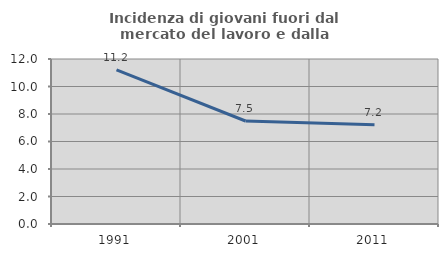
| Category | Incidenza di giovani fuori dal mercato del lavoro e dalla formazione  |
|---|---|
| 1991.0 | 11.215 |
| 2001.0 | 7.492 |
| 2011.0 | 7.216 |